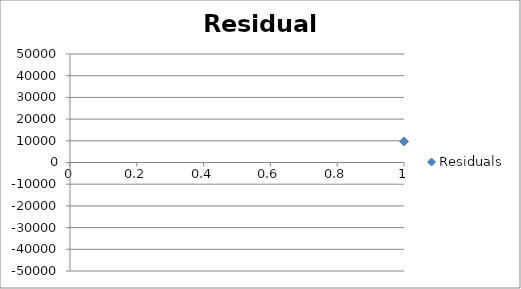
| Category | Residuals |
|---|---|
| 0 | 9714.828 |
| 1 | -29232.348 |
| 2 | 14382.193 |
| 3 | -24743.594 |
| 4 | -15124.379 |
| 5 | -2913.379 |
| 6 | -25263.68 |
| 7 | -25930.89 |
| 8 | 21064.51 |
| 9 | 10448.098 |
| 10 | -20285.543 |
| 11 | 20604.794 |
| 12 | 12262.866 |
| 13 | -28074.274 |
| 14 | -13231.041 |
| 15 | 4841.746 |
| 16 | -26274.87 |
| 17 | 13550.144 |
| 18 | -1133.937 |
| 19 | 14997.037 |
| 20 | -598.034 |
| 21 | -27879.213 |
| 22 | 3941.314 |
| 23 | -12146.353 |
| 24 | -7228.171 |
| 25 | -7228.171 |
| 26 | -38992.532 |
| 27 | 16469.916 |
| 28 | -9189.28 |
| 29 | -10743.385 |
| 30 | 14666.567 |
| 31 | -25413.882 |
| 32 | -13365.804 |
| 33 | -19500.78 |
| 34 | 24339.286 |
| 35 | 23339.286 |
| 36 | 16199.937 |
| 37 | -36138.414 |
| 38 | -16320.492 |
| 39 | -5702.409 |
| 40 | 14465.872 |
| 41 | -37473.494 |
| 42 | 282.307 |
| 43 | -7391.492 |
| 44 | 8516.14 |
| 45 | -7080.771 |
| 46 | -25389.152 |
| 47 | 133.3 |
| 48 | -4057.538 |
| 49 | 11456.073 |
| 50 | -3689.595 |
| 51 | 6154.768 |
| 52 | -2607.635 |
| 53 | 2406.525 |
| 54 | -165.846 |
| 55 | -20357.462 |
| 56 | -9545.905 |
| 57 | -4223.056 |
| 58 | -680.037 |
| 59 | -32436.099 |
| 60 | 443.137 |
| 61 | 35288.654 |
| 62 | -30142.665 |
| 63 | 11894.698 |
| 64 | -1562.571 |
| 65 | -13921.788 |
| 66 | -13369.481 |
| 67 | -4711.44 |
| 68 | 32140.059 |
| 69 | 2626.124 |
| 70 | -2090.693 |
| 71 | 21171.172 |
| 72 | -31299.09 |
| 73 | 15334.663 |
| 74 | 1550.358 |
| 75 | 17300.335 |
| 76 | 9403.697 |
| 77 | 11105.118 |
| 78 | 16639.431 |
| 79 | -6405.891 |
| 80 | -4100.834 |
| 81 | -6501.155 |
| 82 | -24681.664 |
| 83 | -32512.937 |
| 84 | 3603.697 |
| 85 | -26834.357 |
| 86 | -37516.076 |
| 87 | 9973.793 |
| 88 | 15576.871 |
| 89 | -13790.98 |
| 90 | 2275.246 |
| 91 | 24591.462 |
| 92 | 14553.218 |
| 93 | 17521.068 |
| 94 | -27422.991 |
| 95 | 17728.461 |
| 96 | -11049.433 |
| 97 | -2670.939 |
| 98 | 13613.63 |
| 99 | 13228.287 |
| 100 | -15891.317 |
| 101 | 12836.55 |
| 102 | -3587.852 |
| 103 | 2277.432 |
| 104 | 6545.173 |
| 105 | -14479.213 |
| 106 | -8424.055 |
| 107 | -15542.17 |
| 108 | 17229.719 |
| 109 | -2058.387 |
| 110 | 1967.45 |
| 111 | 20346.74 |
| 112 | 12943.54 |
| 113 | 11895.345 |
| 114 | 494.593 |
| 115 | -4320.082 |
| 116 | -22591.14 |
| 117 | 5264.236 |
| 118 | -7029.684 |
| 119 | -14984.814 |
| 120 | -9337.798 |
| 121 | 4215.316 |
| 122 | 8904.279 |
| 123 | -23959.662 |
| 124 | -10724.943 |
| 125 | 16369.489 |
| 126 | -1275.563 |
| 127 | -8498.2 |
| 128 | 5576.916 |
| 129 | -16629.707 |
| 130 | -22936.328 |
| 131 | 31256.635 |
| 132 | 10513.896 |
| 133 | 12655.981 |
| 134 | -25344.36 |
| 135 | 30647.602 |
| 136 | 6656.103 |
| 137 | -12034.094 |
| 138 | 20167.348 |
| 139 | -8041.211 |
| 140 | 19750.934 |
| 141 | 27955.676 |
| 142 | 13136.878 |
| 143 | 18039.662 |
| 144 | 28568.335 |
| 145 | -1948.318 |
| 146 | 10066.249 |
| 147 | -32431.141 |
| 148 | 4996.841 |
| 149 | 13392.636 |
| 150 | -2915.29 |
| 151 | 19127.04 |
| 152 | 1577.575 |
| 153 | 17094.022 |
| 154 | 14010.433 |
| 155 | -29059.554 |
| 156 | -11904.86 |
| 157 | 8155.193 |
| 158 | 1473.475 |
| 159 | -6137.58 |
| 160 | 7661.549 |
| 161 | 158.104 |
| 162 | -32467.331 |
| 163 | 6440.189 |
| 164 | -18685.048 |
| 165 | -9531.533 |
| 166 | -13569.065 |
| 167 | -4330.464 |
| 168 | -1319.328 |
| 169 | -16902.701 |
| 170 | -20233.661 |
| 171 | -24720.142 |
| 172 | -2055.383 |
| 173 | -119.91 |
| 174 | 15724.331 |
| 175 | 20915.281 |
| 176 | -15204.07 |
| 177 | -29516.463 |
| 178 | 6296.274 |
| 179 | -4758.726 |
| 180 | 6615.015 |
| 181 | -4457.937 |
| 182 | 5027.503 |
| 183 | 13462.026 |
| 184 | 11409.934 |
| 185 | 5492.799 |
| 186 | 9343.034 |
| 187 | -284.533 |
| 188 | -36176.157 |
| 189 | 5976.699 |
| 190 | -2537.16 |
| 191 | 15443.612 |
| 192 | -17280.068 |
| 193 | -2279.478 |
| 194 | 5659.932 |
| 195 | 15133.465 |
| 196 | 10775.808 |
| 197 | -7834.966 |
| 198 | -19218.483 |
| 199 | -4754.666 |
| 200 | 6994.726 |
| 201 | -10416.039 |
| 202 | 7256.918 |
| 203 | 11672.133 |
| 204 | 23396.847 |
| 205 | -8580.345 |
| 206 | 33181.36 |
| 207 | -32618.578 |
| 208 | 21529.439 |
| 209 | -27897.275 |
| 210 | 22981.498 |
| 211 | -18196.72 |
| 212 | 27230.301 |
| 213 | 10359.849 |
| 214 | 26392.031 |
| 215 | 16993.668 |
| 216 | -10772.659 |
| 217 | -16767.448 |
| 218 | -17245.312 |
| 219 | 9929.181 |
| 220 | 20737.798 |
| 221 | 27736.842 |
| 222 | 25016.923 |
| 223 | -8885.996 |
| 224 | 1795.93 |
| 225 | -19594.157 |
| 226 | -11531.062 |
| 227 | 23210.104 |
| 228 | 817.238 |
| 229 | -20284.928 |
| 230 | 8252.585 |
| 231 | 15180.813 |
| 232 | 4417.926 |
| 233 | -7747.42 |
| 234 | -4304.258 |
| 235 | -9549.343 |
| 236 | 17276.428 |
| 237 | 14256.2 |
| 238 | 9929.402 |
| 239 | -6190.934 |
| 240 | -30690.616 |
| 241 | 11703.624 |
| 242 | 17935.484 |
| 243 | -370.007 |
| 244 | -21165.046 |
| 245 | -23809.966 |
| 246 | -3702.727 |
| 247 | 16785.614 |
| 248 | 3559.163 |
| 249 | -5908.825 |
| 250 | -17632.658 |
| 251 | -80.254 |
| 252 | 4578.538 |
| 253 | 12970.786 |
| 254 | -11119.246 |
| 255 | 4099.793 |
| 256 | 1031.036 |
| 257 | 13837.252 |
| 258 | -14746.172 |
| 259 | 2059.511 |
| 260 | -16258.365 |
| 261 | 8433.633 |
| 262 | -8590.247 |
| 263 | 24297.195 |
| 264 | 1210.223 |
| 265 | -14182.406 |
| 266 | -19260.001 |
| 267 | 17122.287 |
| 268 | 22091.5 |
| 269 | 8129.495 |
| 270 | 18865.258 |
| 271 | -2187.87 |
| 272 | 23713.061 |
| 273 | 1669.82 |
| 274 | 13480.174 |
| 275 | -3781.377 |
| 276 | -35067.901 |
| 277 | -386.903 |
| 278 | -26623.4 |
| 279 | -18370.291 |
| 280 | -7785.716 |
| 281 | 13422.786 |
| 282 | 20292.403 |
| 283 | -1618.578 |
| 284 | 1791.286 |
| 285 | 12485.604 |
| 286 | -2302.404 |
| 287 | -11461.318 |
| 288 | 1606.374 |
| 289 | 2095.128 |
| 290 | 16344.855 |
| 291 | -18510.267 |
| 292 | -17499.121 |
| 293 | 11635.439 |
| 294 | 19811.943 |
| 295 | 15709.699 |
| 296 | 7672.618 |
| 297 | -24078.685 |
| 298 | 31748.42 |
| 299 | -34470.063 |
| 300 | 29622.658 |
| 301 | -3787.998 |
| 302 | -10024.357 |
| 303 | -8994.839 |
| 304 | 3644.66 |
| 305 | 20255.466 |
| 306 | 25342.899 |
| 307 | -38508.655 |
| 308 | 11111.691 |
| 309 | 21676.541 |
| 310 | -26641.338 |
| 311 | 27826.668 |
| 312 | -25273.7 |
| 313 | 12834.514 |
| 314 | 12441.48 |
| 315 | -9792.236 |
| 316 | 856.318 |
| 317 | 6356.288 |
| 318 | -17583.715 |
| 319 | 1352.707 |
| 320 | 3803.916 |
| 321 | -22755.58 |
| 322 | 17155.868 |
| 323 | 2786.959 |
| 324 | 37153.214 |
| 325 | 32849.874 |
| 326 | 31943.884 |
| 327 | 30679.955 |
| 328 | 16968.393 |
| 329 | 23481.972 |
| 330 | -33814.12 |
| 331 | 7967.449 |
| 332 | 2852.34 |
| 333 | -11852.93 |
| 334 | 5964.446 |
| 335 | 15331.175 |
| 336 | -37872.34 |
| 337 | 29011.537 |
| 338 | -27598.67 |
| 339 | -7347.954 |
| 340 | 13969.767 |
| 341 | -3410.977 |
| 342 | -32452.641 |
| 343 | 1749.325 |
| 344 | 7285.915 |
| 345 | 25134.256 |
| 346 | -12670.937 |
| 347 | 34606.705 |
| 348 | 4948.674 |
| 349 | 4139.214 |